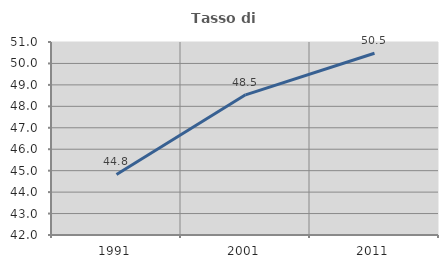
| Category | Tasso di occupazione   |
|---|---|
| 1991.0 | 44.825 |
| 2001.0 | 48.536 |
| 2011.0 | 50.473 |